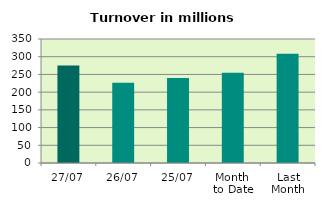
| Category | Series 0 |
|---|---|
| 27/07 | 275.152 |
| 26/07 | 226.273 |
| 25/07 | 240.072 |
| Month 
to Date | 254.537 |
| Last
Month | 308.534 |